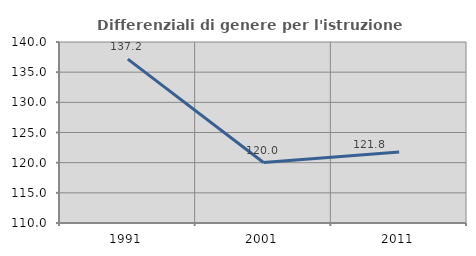
| Category | Differenziali di genere per l'istruzione superiore |
|---|---|
| 1991.0 | 137.156 |
| 2001.0 | 120.022 |
| 2011.0 | 121.782 |